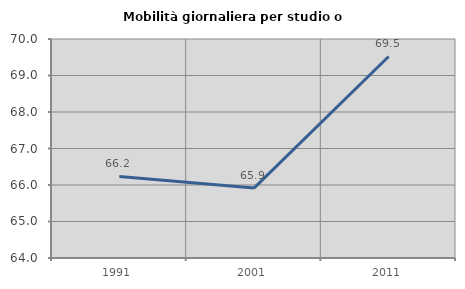
| Category | Mobilità giornaliera per studio o lavoro |
|---|---|
| 1991.0 | 66.236 |
| 2001.0 | 65.915 |
| 2011.0 | 69.522 |